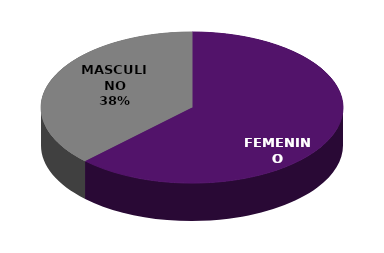
| Category | Series 0 |
|---|---|
| FEMENINO | 10 |
| MASCULINO | 6 |